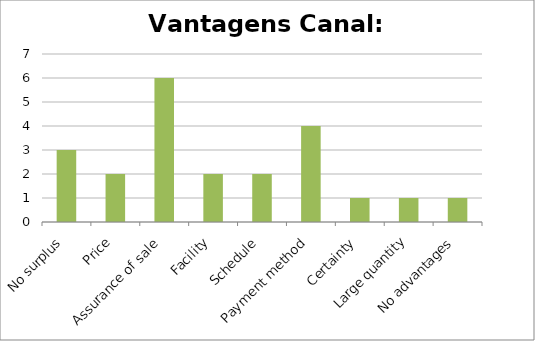
| Category | Series 0 |
|---|---|
| No surplus | 3 |
| Price | 2 |
| Assurance of sale | 6 |
| Facility | 2 |
| Schedule | 2 |
| Payment method | 4 |
| Certainty | 1 |
| Large quantity | 1 |
| No advantages | 1 |